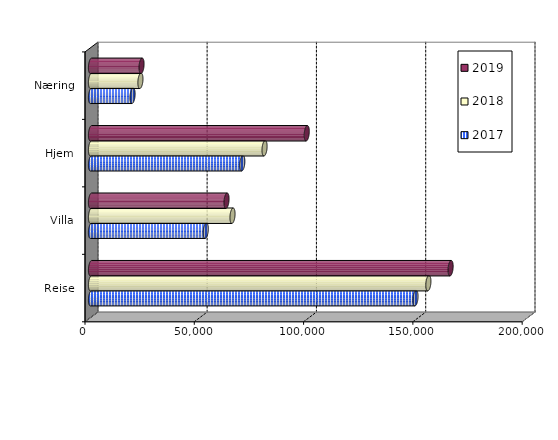
| Category | 2017 | 2018 | 2019 |
|---|---|---|---|
| Reise | 148449 | 154340 | 164509.615 |
| Villa | 52500.266 | 64737.31 | 62005.237 |
| Hjem | 69216.435 | 79397.795 | 98699.425 |
| Næring | 19019.624 | 22608.497 | 23125.532 |